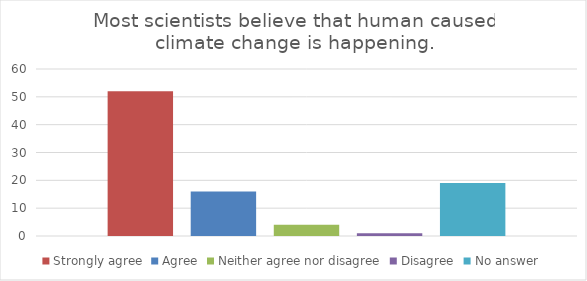
| Category | Strongly agree | Agree | Neither agree nor disagree | Disagree | No answer |
|---|---|---|---|---|---|
| 0 | 52 | 16 | 4 | 1 | 19 |